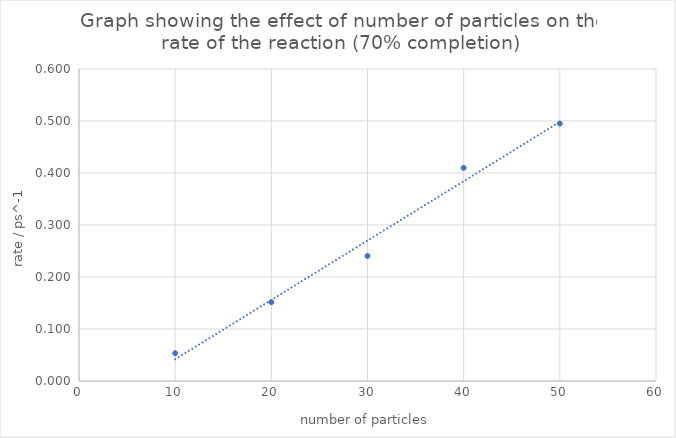
| Category | rate = 1/time (ps⁻¹) |
|---|---|
| 10.0 | 0.053 |
| 20.0 | 0.152 |
| 30.0 | 0.24 |
| 40.0 | 0.41 |
| 50.0 | 0.495 |